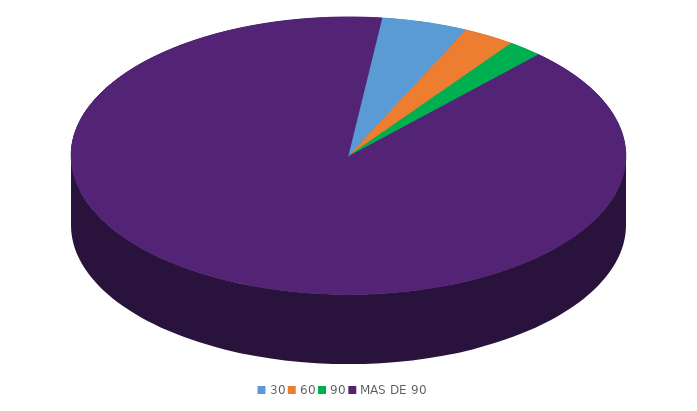
| Category | Series 0 |
|---|---|
| 30 | 1556299.7 |
| 60 | 933779.8 |
| 90 | 622519.9 |
| MAS DE 90 | 28013395.1 |